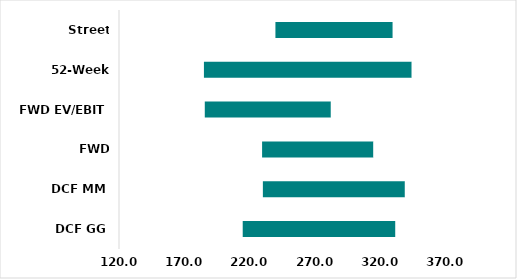
| Category | Series 0 | Series 1 | Series 2 |
|---|---|---|---|
| DCF GG | 214.907 | 117.181 | 332.088 |
| DCF MM | 230.365 | 108.934 | 339.3 |
| FWD EV/EBITDA | 229.771 | 85.412 | 315.183 |
| FWD EV/EBIT | 185.805 | 96.715 | 282.52 |
| 52-Week Range | 185.15 | 159.4 | 344.55 |
| Street Estimate | 240 | 90 | 330 |